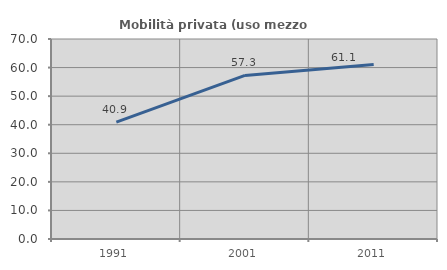
| Category | Mobilità privata (uso mezzo privato) |
|---|---|
| 1991.0 | 40.922 |
| 2001.0 | 57.263 |
| 2011.0 | 61.062 |